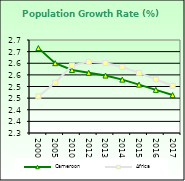
| Category | Cameroon | Africa  |
|---|---|---|
| 2000.0 | 2.665 | 2.458 |
| 2005.0 | 2.6 | 2.516 |
| 2010.0 | 2.571 | 2.59 |
| 2012.0 | 2.559 | 2.606 |
| 2013.0 | 2.547 | 2.601 |
| 2014.0 | 2.53 | 2.584 |
| 2015.0 | 2.508 | 2.559 |
| 2016.0 | 2.486 | 2.531 |
| 2017.0 | 2.463 | 2.503 |